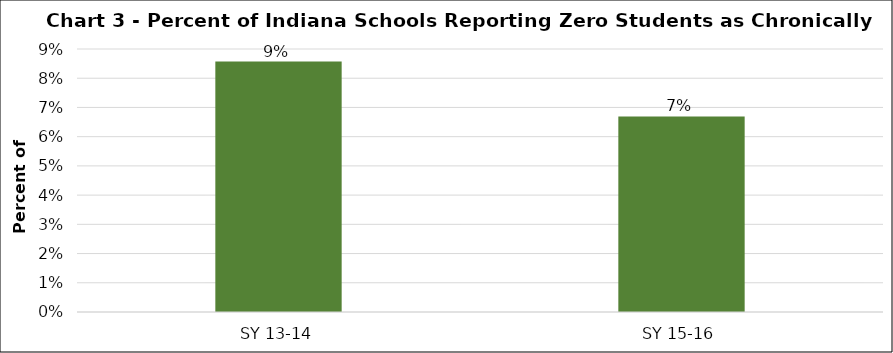
| Category | Series 0 |
|---|---|
| SY 13-14 | 0.086 |
| SY 15-16 | 0.067 |